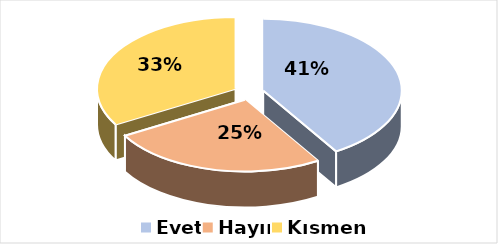
| Category | Evet |
|---|---|
| Evet | 0.412 |
| Hayır | 0.255 |
| Kısmen | 0.333 |